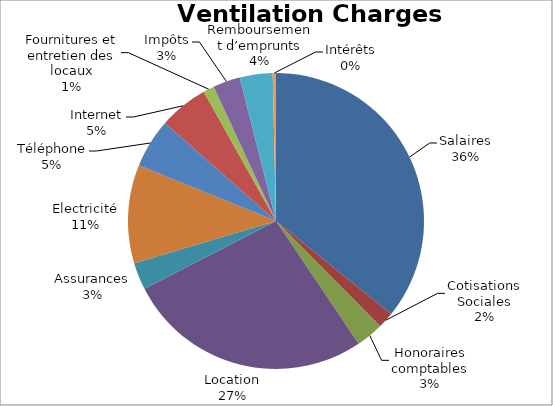
| Category | Series 0 |
|---|---|
| Salaires | 1200 |
| Cotisations Sociales | 60 |
| Honoraires comptables | 100 |
| Location | 900 |
| Assurances | 100 |
| Electricité | 360 |
| Téléphone | 180 |
| Internet | 180 |
| Petites fournitures et entretien des locaux | 40 |
| Impôts | 100 |
| Remboursement d’emprunts | 120 |
| Intérêts | 12 |